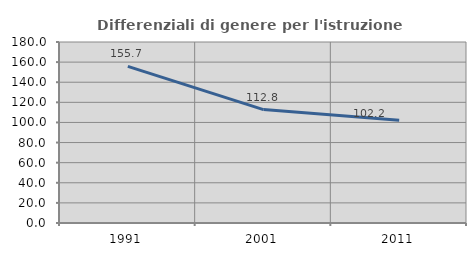
| Category | Differenziali di genere per l'istruzione superiore |
|---|---|
| 1991.0 | 155.739 |
| 2001.0 | 112.802 |
| 2011.0 | 102.248 |